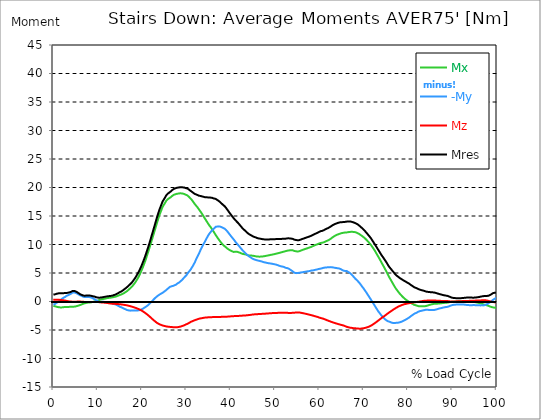
| Category |  Mx |  -My |  Mz |  Mres |
|---|---|---|---|---|
| 0.0 | -0.78 | -0.549 | 0.324 | 1.223 |
| 0.167348456675344 | -0.805 | -0.505 | 0.324 | 1.229 |
| 0.334696913350688 | -0.83 | -0.449 | 0.324 | 1.248 |
| 0.5020453700260321 | -0.867 | -0.356 | 0.306 | 1.304 |
| 0.669393826701376 | -0.905 | -0.262 | 0.306 | 1.341 |
| 0.83674228337672 | -0.936 | -0.168 | 0.306 | 1.385 |
| 1.0040907400520642 | -0.967 | -0.081 | 0.306 | 1.404 |
| 1.1621420602454444 | -0.998 | 0.006 | 0.312 | 1.435 |
| 1.3294905169207885 | -1.023 | 0.106 | 0.299 | 1.46 |
| 1.4968389735961325 | -1.036 | 0.206 | 0.274 | 1.447 |
| 1.6641874302714765 | -1.042 | 0.306 | 0.256 | 1.441 |
| 1.8315358869468206 | -1.036 | 0.405 | 0.243 | 1.441 |
| 1.9988843436221646 | -1.029 | 0.505 | 0.231 | 1.46 |
| 2.1662328002975086 | -1.017 | 0.599 | 0.218 | 1.466 |
| 2.333581256972853 | -0.992 | 0.674 | 0.206 | 1.466 |
| 2.5009297136481967 | -0.973 | 0.736 | 0.181 | 1.478 |
| 2.6682781703235405 | -0.961 | 0.805 | 0.162 | 1.485 |
| 2.8356266269988843 | -0.948 | 0.873 | 0.137 | 1.485 |
| 3.002975083674229 | -0.961 | 1.004 | 0.094 | 1.491 |
| 3.1703235403495724 | -0.954 | 1.048 | 0.075 | 1.522 |
| 3.337671997024917 | -0.948 | 1.098 | 0.05 | 1.547 |
| 3.4957233172182973 | -0.942 | 1.16 | 0.031 | 1.572 |
| 3.663071773893641 | -0.942 | 1.235 | 0.012 | 1.616 |
| 3.8304202305689854 | -0.936 | 1.304 | 0.006 | 1.653 |
| 3.997768687244329 | -0.929 | 1.372 | -0.012 | 1.697 |
| 4.165117143919673 | -0.929 | 1.472 | -0.025 | 1.778 |
| 4.332465600595017 | -0.929 | 1.572 | -0.037 | 1.859 |
| 4.499814057270361 | -0.917 | 1.603 | -0.044 | 1.878 |
| 4.667162513945706 | -0.905 | 1.591 | -0.056 | 1.859 |
| 4.834510970621049 | -0.892 | 1.566 | -0.062 | 1.834 |
| 5.001859427296393 | -0.867 | 1.528 | -0.037 | 1.784 |
| 5.169207883971737 | -0.83 | 1.478 | -0.025 | 1.722 |
| 5.336556340647081 | -0.798 | 1.41 | -0.019 | 1.647 |
| 5.503904797322425 | -0.761 | 1.329 | -0.019 | 1.553 |
| 5.671253253997769 | -0.724 | 1.248 | -0.012 | 1.466 |
| 5.82930457419115 | -0.68 | 1.185 | -0.019 | 1.391 |
| 5.996653030866494 | -0.63 | 1.104 | -0.019 | 1.298 |
| 6.164001487541838 | -0.58 | 1.048 | -0.025 | 1.229 |
| 6.331349944217181 | -0.524 | 0.998 | -0.025 | 1.173 |
| 6.498698400892526 | -0.468 | 0.929 | -0.037 | 1.117 |
| 6.66604685756787 | -0.418 | 0.867 | -0.05 | 1.067 |
| 6.833395314243213 | -0.368 | 0.817 | -0.062 | 1.036 |
| 7.000743770918558 | -0.324 | 0.786 | -0.075 | 1.017 |
| 7.168092227593902 | -0.293 | 0.774 | -0.087 | 1.023 |
| 7.335440684269246 | -0.262 | 0.78 | -0.094 | 1.036 |
| 7.50278914094459 | -0.237 | 0.774 | -0.1 | 1.036 |
| 7.6701375976199335 | -0.206 | 0.767 | -0.106 | 1.036 |
| 7.837486054295278 | -0.187 | 0.78 | -0.106 | 1.048 |
| 7.995537374488658 | -0.175 | 0.786 | -0.106 | 1.06 |
| 8.162885831164003 | -0.168 | 0.774 | -0.094 | 1.048 |
| 8.330234287839346 | -0.156 | 0.749 | -0.094 | 1.029 |
| 8.49758274451469 | -0.143 | 0.711 | -0.094 | 0.998 |
| 8.664931201190035 | -0.119 | 0.649 | -0.087 | 0.967 |
| 8.832279657865378 | -0.087 | 0.593 | -0.081 | 0.923 |
| 8.999628114540721 | -0.056 | 0.524 | -0.087 | 0.905 |
| 9.166976571216066 | -0.031 | 0.449 | -0.094 | 0.886 |
| 9.334325027891412 | 0.006 | 0.374 | -0.094 | 0.848 |
| 9.501673484566755 | 0.044 | 0.293 | -0.087 | 0.786 |
| 9.669021941242098 | 0.075 | 0.225 | -0.094 | 0.736 |
| 9.836370397917442 | 0.119 | 0.156 | -0.094 | 0.717 |
| 10.003718854592787 | 0.156 | 0.081 | -0.106 | 0.705 |
| 10.17106731126813 | 0.2 | 0 | -0.106 | 0.674 |
| 10.329118631461512 | 0.262 | -0.1 | -0.112 | 0.655 |
| 10.496467088136853 | 0.306 | -0.125 | -0.125 | 0.674 |
| 10.663815544812199 | 0.343 | -0.112 | -0.143 | 0.692 |
| 10.831164001487544 | 0.368 | -0.056 | -0.162 | 0.699 |
| 10.998512458162887 | 0.405 | -0.037 | -0.175 | 0.73 |
| 11.16586091483823 | 0.437 | -0.031 | -0.181 | 0.767 |
| 11.333209371513574 | 0.455 | -0.044 | -0.193 | 0.78 |
| 11.50055782818892 | 0.48 | -0.069 | -0.2 | 0.805 |
| 11.667906284864264 | 0.505 | -0.112 | -0.212 | 0.83 |
| 11.835254741539607 | 0.53 | -0.143 | -0.225 | 0.855 |
| 12.00260319821495 | 0.568 | -0.187 | -0.243 | 0.88 |
| 12.169951654890292 | 0.599 | -0.218 | -0.262 | 0.911 |
| 12.337300111565641 | 0.618 | -0.225 | -0.287 | 0.923 |
| 12.504648568240984 | 0.636 | -0.231 | -0.312 | 0.936 |
| 12.662699888434362 | 0.655 | -0.256 | -0.331 | 0.954 |
| 12.830048345109708 | 0.667 | -0.262 | -0.349 | 0.967 |
| 12.997396801785053 | 0.686 | -0.274 | -0.362 | 0.986 |
| 13.164745258460396 | 0.705 | -0.299 | -0.374 | 0.998 |
| 13.33209371513574 | 0.73 | -0.343 | -0.381 | 1.029 |
| 13.499442171811083 | 0.761 | -0.393 | -0.387 | 1.073 |
| 13.666790628486426 | 0.798 | -0.449 | -0.393 | 1.129 |
| 13.834139085161771 | 0.817 | -0.462 | -0.405 | 1.16 |
| 14.001487541837117 | 0.848 | -0.505 | -0.418 | 1.21 |
| 14.16883599851246 | 0.892 | -0.568 | -0.424 | 1.273 |
| 14.336184455187803 | 0.936 | -0.63 | -0.437 | 1.347 |
| 14.503532911863147 | 0.986 | -0.699 | -0.443 | 1.41 |
| 14.670881368538492 | 1.036 | -0.774 | -0.455 | 1.485 |
| 14.828932688731873 | 1.085 | -0.836 | -0.468 | 1.553 |
| 14.996281145407215 | 1.142 | -0.923 | -0.474 | 1.647 |
| 15.163629602082558 | 1.191 | -0.973 | -0.487 | 1.709 |
| 15.330978058757903 | 1.241 | -1.004 | -0.512 | 1.759 |
| 15.498326515433247 | 1.291 | -1.06 | -0.53 | 1.84 |
| 15.665674972108594 | 1.354 | -1.148 | -0.549 | 1.94 |
| 15.833023428783937 | 1.416 | -1.21 | -0.568 | 2.034 |
| 16.00037188545928 | 1.497 | -1.279 | -0.586 | 2.14 |
| 16.167720342134626 | 1.578 | -1.335 | -0.611 | 2.239 |
| 16.335068798809967 | 1.672 | -1.385 | -0.636 | 2.339 |
| 16.502417255485312 | 1.759 | -1.441 | -0.655 | 2.445 |
| 16.669765712160658 | 1.853 | -1.503 | -0.68 | 2.558 |
| 16.837114168836 | 1.959 | -1.528 | -0.711 | 2.664 |
| 17.004462625511344 | 2.084 | -1.56 | -0.749 | 2.795 |
| 17.16251394570472 | 2.208 | -1.584 | -0.78 | 2.919 |
| 17.32986240238007 | 2.321 | -1.603 | -0.817 | 3.038 |
| 17.497210859055414 | 2.433 | -1.609 | -0.855 | 3.163 |
| 17.664559315730756 | 2.564 | -1.591 | -0.892 | 3.294 |
| 17.8319077724061 | 2.707 | -1.547 | -0.936 | 3.45 |
| 17.999256229081443 | 2.863 | -1.566 | -0.979 | 3.624 |
| 18.166604685756788 | 3.032 | -1.597 | -1.017 | 3.811 |
| 18.333953142432133 | 3.194 | -1.572 | -1.054 | 3.986 |
| 18.501301599107478 | 3.369 | -1.566 | -1.104 | 4.18 |
| 18.668650055782823 | 3.574 | -1.578 | -1.154 | 4.398 |
| 18.835998512458165 | 3.793 | -1.578 | -1.204 | 4.622 |
| 19.00334696913351 | 4.005 | -1.578 | -1.254 | 4.853 |
| 19.170695425808855 | 4.236 | -1.566 | -1.31 | 5.084 |
| 19.338043882484197 | 4.491 | -1.522 | -1.366 | 5.34 |
| 19.496095202677576 | 4.766 | -1.51 | -1.429 | 5.602 |
| 19.66344365935292 | 5.047 | -1.472 | -1.491 | 5.882 |
| 19.830792116028263 | 5.346 | -1.41 | -1.56 | 6.169 |
| 19.998140572703612 | 5.645 | -1.335 | -1.634 | 6.481 |
| 20.165489029378953 | 5.957 | -1.254 | -1.722 | 6.806 |
| 20.3328374860543 | 6.294 | -1.198 | -1.803 | 7.136 |
| 20.500185942729644 | 6.644 | -1.11 | -1.89 | 7.486 |
| 20.667534399404985 | 6.993 | -1.023 | -1.977 | 7.841 |
| 20.83488285608033 | 7.367 | -0.936 | -2.071 | 8.209 |
| 21.002231312755672 | 7.76 | -0.855 | -2.171 | 8.596 |
| 21.16957976943102 | 8.172 | -0.767 | -2.277 | 9.002 |
| 21.336928226106362 | 8.571 | -0.655 | -2.383 | 9.401 |
| 21.504276682781704 | 8.97 | -0.543 | -2.495 | 9.8 |
| 21.67162513945705 | 9.376 | -0.424 | -2.601 | 10.212 |
| 21.82967645965043 | 9.806 | -0.306 | -2.714 | 10.642 |
| 21.997024916325774 | 10.237 | -0.162 | -2.838 | 11.085 |
| 22.16437337300112 | 10.667 | -0.019 | -2.957 | 11.534 |
| 22.33172182967646 | 11.085 | 0.112 | -3.082 | 11.965 |
| 22.499070286351806 | 11.515 | 0.256 | -3.194 | 12.408 |
| 22.666418743027148 | 11.946 | 0.387 | -3.3 | 12.85 |
| 22.833767199702496 | 12.376 | 0.518 | -3.406 | 13.293 |
| 23.00111565637784 | 12.813 | 0.643 | -3.518 | 13.742 |
| 23.168464113053183 | 13.25 | 0.767 | -3.631 | 14.204 |
| 23.335812569728528 | 13.693 | 0.867 | -3.724 | 14.647 |
| 23.50316102640387 | 14.11 | 0.967 | -3.799 | 15.065 |
| 23.670509483079215 | 14.522 | 1.067 | -3.88 | 15.483 |
| 23.83785793975456 | 14.94 | 1.167 | -3.955 | 15.895 |
| 23.995909259947936 | 15.321 | 1.241 | -4.011 | 16.275 |
| 24.163257716623285 | 15.633 | 1.316 | -4.067 | 16.587 |
| 24.330606173298627 | 15.976 | 1.391 | -4.117 | 16.924 |
| 24.49795462997397 | 16.325 | 1.466 | -4.167 | 17.267 |
| 24.665303086649313 | 16.643 | 1.541 | -4.217 | 17.585 |
| 24.83265154332466 | 16.855 | 1.641 | -4.248 | 17.791 |
| 25.0 | 17.055 | 1.74 | -4.279 | 17.991 |
| 25.167348456675345 | 17.267 | 1.822 | -4.311 | 18.209 |
| 25.334696913350694 | 17.492 | 1.928 | -4.348 | 18.44 |
| 25.502045370026035 | 17.704 | 2.027 | -4.379 | 18.658 |
| 25.669393826701377 | 17.841 | 2.152 | -4.398 | 18.802 |
| 25.836742283376722 | 17.959 | 2.277 | -4.417 | 18.926 |
| 26.004090740052067 | 18.072 | 2.377 | -4.429 | 19.051 |
| 26.17143919672741 | 18.128 | 2.483 | -4.448 | 19.12 |
| 26.329490516920792 | 18.196 | 2.576 | -4.46 | 19.201 |
| 26.49683897359613 | 18.309 | 2.632 | -4.466 | 19.326 |
| 26.66418743027148 | 18.427 | 2.676 | -4.479 | 19.444 |
| 26.831535886946828 | 18.54 | 2.707 | -4.498 | 19.563 |
| 26.998884343622166 | 18.627 | 2.739 | -4.504 | 19.656 |
| 27.166232800297514 | 18.708 | 2.782 | -4.504 | 19.743 |
| 27.333581256972852 | 18.758 | 2.845 | -4.504 | 19.8 |
| 27.5009297136482 | 18.814 | 2.907 | -4.516 | 19.856 |
| 27.668278170323543 | 18.87 | 2.963 | -4.523 | 19.918 |
| 27.835626626998888 | 18.883 | 3.063 | -4.516 | 19.943 |
| 28.002975083674233 | 18.901 | 3.163 | -4.504 | 19.962 |
| 28.170323540349575 | 18.933 | 3.244 | -4.485 | 19.993 |
| 28.33767199702492 | 18.951 | 3.312 | -4.46 | 20.012 |
| 28.50502045370026 | 18.97 | 3.406 | -4.429 | 20.03 |
| 28.663071773893645 | 18.976 | 3.531 | -4.404 | 20.043 |
| 28.830420230568986 | 18.97 | 3.649 | -4.367 | 20.037 |
| 28.99776868724433 | 18.951 | 3.762 | -4.323 | 20.03 |
| 29.165117143919673 | 18.933 | 3.893 | -4.273 | 20.024 |
| 29.33246560059502 | 18.914 | 4.049 | -4.229 | 20.018 |
| 29.499814057270367 | 18.876 | 4.198 | -4.18 | 19.999 |
| 29.66716251394571 | 18.814 | 4.342 | -4.123 | 19.956 |
| 29.834510970621054 | 18.745 | 4.46 | -4.055 | 19.899 |
| 30.00185942729639 | 18.708 | 4.591 | -3.992 | 19.874 |
| 30.169207883971744 | 18.639 | 4.785 | -3.936 | 19.837 |
| 30.33655634064708 | 18.54 | 5.003 | -3.886 | 19.781 |
| 30.50390479732243 | 18.427 | 5.171 | -3.811 | 19.694 |
| 30.671253253997772 | 18.302 | 5.315 | -3.73 | 19.588 |
| 30.829304574191156 | 18.165 | 5.446 | -3.649 | 19.475 |
| 30.996653030866494 | 18.028 | 5.62 | -3.574 | 19.382 |
| 31.164001487541842 | 17.885 | 5.864 | -3.525 | 19.301 |
| 31.331349944217187 | 17.716 | 6.057 | -3.462 | 19.195 |
| 31.498698400892525 | 17.541 | 6.275 | -3.406 | 19.101 |
| 31.666046857567874 | 17.354 | 6.525 | -3.356 | 19.007 |
| 31.833395314243212 | 17.173 | 6.756 | -3.3 | 18.908 |
| 32.00074377091856 | 17.005 | 7.024 | -3.25 | 18.826 |
| 32.1680922275939 | 16.849 | 7.336 | -3.213 | 18.795 |
| 32.33544068426925 | 16.693 | 7.617 | -3.169 | 18.745 |
| 32.50278914094459 | 16.531 | 7.879 | -3.119 | 18.683 |
| 32.670137597619934 | 16.362 | 8.128 | -3.075 | 18.627 |
| 32.83748605429528 | 16.175 | 8.371 | -3.038 | 18.558 |
| 33.004834510970625 | 15.988 | 8.677 | -2.994 | 18.54 |
| 33.162885831164004 | 15.801 | 8.97 | -2.969 | 18.521 |
| 33.33023428783935 | 15.608 | 9.264 | -2.944 | 18.483 |
| 33.497582744514695 | 15.42 | 9.507 | -2.926 | 18.44 |
| 33.664931201190036 | 15.221 | 9.756 | -2.901 | 18.396 |
| 33.83227965786538 | 15.015 | 10.018 | -2.882 | 18.377 |
| 33.99962811454073 | 14.79 | 10.249 | -2.845 | 18.346 |
| 34.16697657121607 | 14.578 | 10.467 | -2.826 | 18.302 |
| 34.33432502789141 | 14.379 | 10.729 | -2.813 | 18.29 |
| 34.50167348456676 | 14.173 | 10.979 | -2.801 | 18.284 |
| 34.6690219412421 | 13.967 | 11.216 | -2.795 | 18.271 |
| 34.83637039791744 | 13.761 | 11.447 | -2.782 | 18.265 |
| 35.00371885459279 | 13.555 | 11.678 | -2.77 | 18.259 |
| 35.17106731126814 | 13.362 | 11.884 | -2.757 | 18.259 |
| 35.338415767943474 | 13.194 | 12.052 | -2.751 | 18.246 |
| 35.49646708813686 | 13.031 | 12.195 | -2.745 | 18.221 |
| 35.6638155448122 | 12.838 | 12.376 | -2.745 | 18.215 |
| 35.831164001487544 | 12.638 | 12.514 | -2.745 | 18.184 |
| 35.998512458162885 | 12.445 | 12.62 | -2.739 | 18.128 |
| 36.165860914838234 | 12.252 | 12.726 | -2.739 | 18.078 |
| 36.333209371513576 | 12.033 | 12.869 | -2.732 | 18.047 |
| 36.50055782818892 | 11.821 | 13.019 | -2.732 | 18.034 |
| 36.667906284864266 | 11.615 | 13.119 | -2.726 | 17.991 |
| 36.83525474153961 | 11.422 | 13.131 | -2.726 | 17.891 |
| 37.002603198214956 | 11.235 | 13.15 | -2.72 | 17.797 |
| 37.1699516548903 | 11.041 | 13.175 | -2.72 | 17.716 |
| 37.337300111565646 | 10.86 | 13.181 | -2.714 | 17.623 |
| 37.50464856824098 | 10.686 | 13.162 | -2.707 | 17.516 |
| 37.66269988843437 | 10.511 | 13.125 | -2.701 | 17.398 |
| 37.83004834510971 | 10.343 | 13.081 | -2.701 | 17.279 |
| 37.99739680178505 | 10.174 | 13.031 | -2.695 | 17.155 |
| 38.16474525846039 | 10.037 | 12.956 | -2.689 | 17.03 |
| 38.33209371513574 | 9.9 | 12.894 | -2.689 | 16.905 |
| 38.49944217181109 | 9.781 | 12.838 | -2.689 | 16.812 |
| 38.666790628486424 | 9.681 | 12.763 | -2.682 | 16.693 |
| 38.83413908516178 | 9.582 | 12.645 | -2.676 | 16.55 |
| 39.001487541837115 | 9.463 | 12.52 | -2.67 | 16.387 |
| 39.16883599851246 | 9.357 | 12.358 | -2.664 | 16.194 |
| 39.336184455187805 | 9.245 | 12.214 | -2.651 | 16.013 |
| 39.503532911863154 | 9.145 | 12.052 | -2.645 | 15.832 |
| 39.670881368538495 | 9.07 | 11.871 | -2.632 | 15.639 |
| 39.83822982521384 | 9.002 | 11.709 | -2.62 | 15.47 |
| 39.996281145407224 | 8.933 | 11.54 | -2.608 | 15.296 |
| 40.163629602082565 | 8.871 | 11.378 | -2.601 | 15.121 |
| 40.33097805875791 | 8.808 | 11.216 | -2.589 | 14.953 |
| 40.498326515433256 | 8.746 | 11.066 | -2.576 | 14.79 |
| 40.6656749721086 | 8.696 | 10.904 | -2.57 | 14.622 |
| 40.83302342878393 | 8.677 | 10.754 | -2.558 | 14.479 |
| 41.00037188545929 | 8.721 | 10.555 | -2.551 | 14.323 |
| 41.16772034213463 | 8.74 | 10.374 | -2.545 | 14.179 |
| 41.33506879880997 | 8.746 | 10.205 | -2.539 | 14.048 |
| 41.50241725548531 | 8.69 | 10.074 | -2.533 | 13.905 |
| 41.66976571216066 | 8.665 | 9.937 | -2.526 | 13.786 |
| 41.837114168836 | 8.621 | 9.781 | -2.526 | 13.63 |
| 42.004462625511344 | 8.577 | 9.625 | -2.52 | 13.48 |
| 42.17181108218669 | 8.527 | 9.463 | -2.514 | 13.325 |
| 42.32986240238007 | 8.471 | 9.301 | -2.501 | 13.162 |
| 42.497210859055414 | 8.415 | 9.145 | -2.495 | 13 |
| 42.66455931573076 | 8.359 | 9.008 | -2.477 | 12.857 |
| 42.831907772406105 | 8.328 | 8.864 | -2.47 | 12.719 |
| 42.999256229081446 | 8.309 | 8.733 | -2.464 | 12.607 |
| 43.16660468575679 | 8.297 | 8.596 | -2.452 | 12.489 |
| 43.33395314243214 | 8.265 | 8.471 | -2.445 | 12.37 |
| 43.50130159910748 | 8.216 | 8.347 | -2.433 | 12.239 |
| 43.66865005578282 | 8.172 | 8.234 | -2.42 | 12.121 |
| 43.83599851245817 | 8.122 | 8.122 | -2.408 | 12.002 |
| 44.00334696913351 | 8.091 | 8.01 | -2.389 | 11.896 |
| 44.17069542580886 | 8.066 | 7.91 | -2.383 | 11.796 |
| 44.3380438824842 | 8.066 | 7.823 | -2.364 | 11.728 |
| 44.49609520267758 | 8.066 | 7.735 | -2.339 | 11.665 |
| 44.66344365935292 | 8.06 | 7.648 | -2.321 | 11.59 |
| 44.83079211602827 | 8.041 | 7.561 | -2.302 | 11.515 |
| 44.99814057270361 | 8.028 | 7.486 | -2.283 | 11.441 |
| 45.16548902937895 | 8.003 | 7.423 | -2.271 | 11.384 |
| 45.332837486054295 | 7.978 | 7.367 | -2.258 | 11.322 |
| 45.500185942729644 | 7.954 | 7.336 | -2.246 | 11.278 |
| 45.66753439940499 | 7.929 | 7.305 | -2.239 | 11.235 |
| 45.83488285608033 | 7.904 | 7.249 | -2.233 | 11.172 |
| 46.00223131275568 | 7.879 | 7.217 | -2.221 | 11.129 |
| 46.16957976943102 | 7.866 | 7.18 | -2.215 | 11.091 |
| 46.336928226106366 | 7.872 | 7.149 | -2.208 | 11.06 |
| 46.50427668278171 | 7.872 | 7.124 | -2.196 | 11.035 |
| 46.671625139457056 | 7.872 | 7.093 | -2.19 | 11.016 |
| 46.829676459650436 | 7.879 | 7.061 | -2.177 | 10.991 |
| 46.99702491632577 | 7.891 | 7.018 | -2.171 | 10.967 |
| 47.16437337300112 | 7.904 | 6.974 | -2.165 | 10.942 |
| 47.33172182967646 | 7.916 | 6.93 | -2.152 | 10.917 |
| 47.49907028635181 | 7.929 | 6.893 | -2.146 | 10.892 |
| 47.66641874302716 | 7.96 | 6.868 | -2.14 | 10.892 |
| 47.83376719970249 | 7.985 | 6.837 | -2.133 | 10.892 |
| 48.001115656377834 | 8.01 | 6.806 | -2.121 | 10.885 |
| 48.16846411305319 | 8.028 | 6.775 | -2.115 | 10.879 |
| 48.33581256972853 | 8.06 | 6.743 | -2.102 | 10.879 |
| 48.50316102640387 | 8.091 | 6.725 | -2.09 | 10.885 |
| 48.67050948307921 | 8.116 | 6.712 | -2.077 | 10.892 |
| 48.837857939754564 | 8.147 | 6.687 | -2.071 | 10.904 |
| 49.005206396429905 | 8.178 | 6.675 | -2.059 | 10.91 |
| 49.163257716623285 | 8.197 | 6.65 | -2.046 | 10.91 |
| 49.33060617329863 | 8.222 | 6.625 | -2.04 | 10.91 |
| 49.49795462997397 | 8.247 | 6.594 | -2.027 | 10.91 |
| 49.66530308664932 | 8.278 | 6.569 | -2.021 | 10.917 |
| 49.832651543324666 | 8.303 | 6.537 | -2.021 | 10.923 |
| 50.0 | 8.334 | 6.506 | -2.015 | 10.929 |
| 50.16734845667534 | 8.371 | 6.488 | -2.015 | 10.948 |
| 50.33469691335069 | 8.409 | 6.469 | -2.015 | 10.967 |
| 50.50204537002604 | 8.44 | 6.413 | -1.996 | 10.954 |
| 50.66939382670139 | 8.471 | 6.363 | -1.99 | 10.948 |
| 50.836742283376715 | 8.496 | 6.3 | -1.971 | 10.935 |
| 51.00409074005207 | 8.534 | 6.263 | -1.971 | 10.954 |
| 51.17143919672741 | 8.571 | 6.213 | -1.971 | 10.948 |
| 51.32949051692079 | 8.609 | 6.176 | -1.971 | 10.96 |
| 51.496838973596134 | 8.646 | 6.144 | -1.977 | 10.979 |
| 51.66418743027148 | 8.677 | 6.132 | -1.984 | 11.004 |
| 51.831535886946824 | 8.715 | 6.107 | -1.984 | 11.016 |
| 51.99888434362217 | 8.752 | 6.07 | -1.984 | 11.029 |
| 52.16623280029752 | 8.783 | 6.007 | -1.984 | 11.029 |
| 52.33358125697285 | 8.821 | 5.939 | -1.971 | 11.016 |
| 52.5009297136482 | 8.858 | 5.882 | -1.971 | 11.023 |
| 52.668278170323546 | 8.895 | 5.87 | -1.977 | 11.06 |
| 52.835626626998895 | 8.927 | 5.851 | -1.99 | 11.085 |
| 53.00297508367424 | 8.952 | 5.808 | -2.002 | 11.091 |
| 53.17032354034958 | 8.964 | 5.733 | -2.009 | 11.079 |
| 53.33767199702492 | 8.977 | 5.652 | -2.009 | 11.066 |
| 53.50502045370027 | 8.989 | 5.546 | -2.002 | 11.048 |
| 53.663071773893655 | 8.995 | 5.465 | -2.002 | 11.035 |
| 53.83042023056899 | 8.995 | 5.377 | -1.996 | 11.016 |
| 53.99776868724433 | 8.983 | 5.277 | -1.984 | 10.985 |
| 54.16511714391967 | 8.933 | 5.171 | -1.971 | 10.923 |
| 54.33246560059503 | 8.877 | 5.078 | -1.959 | 10.867 |
| 54.49981405727037 | 8.846 | 5.015 | -1.959 | 10.823 |
| 54.667162513945705 | 8.821 | 4.984 | -1.946 | 10.798 |
| 54.834510970621054 | 8.802 | 4.978 | -1.928 | 10.779 |
| 55.0018594272964 | 8.777 | 4.99 | -1.915 | 10.754 |
| 55.169207883971744 | 8.777 | 4.997 | -1.915 | 10.742 |
| 55.336556340647086 | 8.796 | 5.028 | -1.921 | 10.748 |
| 55.50390479732243 | 8.833 | 5.047 | -1.94 | 10.779 |
| 55.671253253997776 | 8.877 | 5.078 | -1.953 | 10.817 |
| 55.83860171067312 | 8.927 | 5.084 | -1.977 | 10.867 |
| 55.9966530308665 | 8.989 | 5.109 | -2.002 | 10.929 |
| 56.16400148754184 | 9.039 | 5.134 | -2.027 | 10.979 |
| 56.33134994421718 | 9.083 | 5.159 | -2.052 | 11.01 |
| 56.498698400892536 | 9.126 | 5.178 | -2.084 | 11.054 |
| 56.66604685756788 | 9.176 | 5.203 | -2.108 | 11.104 |
| 56.83339531424321 | 9.22 | 5.221 | -2.14 | 11.147 |
| 57.00074377091856 | 9.264 | 5.246 | -2.171 | 11.197 |
| 57.16809222759391 | 9.307 | 5.271 | -2.202 | 11.241 |
| 57.33544068426925 | 9.351 | 5.277 | -2.233 | 11.285 |
| 57.5027891409446 | 9.401 | 5.302 | -2.271 | 11.335 |
| 57.670137597619934 | 9.444 | 5.321 | -2.302 | 11.378 |
| 57.83748605429528 | 9.488 | 5.352 | -2.327 | 11.422 |
| 58.004834510970625 | 9.526 | 5.396 | -2.358 | 11.472 |
| 58.16288583116401 | 9.582 | 5.421 | -2.389 | 11.534 |
| 58.330234287839346 | 9.638 | 5.44 | -2.42 | 11.59 |
| 58.497582744514695 | 9.694 | 5.458 | -2.458 | 11.646 |
| 58.66493120119004 | 9.756 | 5.477 | -2.501 | 11.715 |
| 58.832279657865385 | 9.819 | 5.508 | -2.539 | 11.777 |
| 58.999628114540734 | 9.875 | 5.533 | -2.576 | 11.846 |
| 59.16697657121607 | 9.931 | 5.564 | -2.62 | 11.915 |
| 59.33432502789142 | 9.975 | 5.596 | -2.651 | 11.971 |
| 59.50167348456676 | 10.025 | 5.627 | -2.682 | 12.027 |
| 59.66902194124211 | 10.074 | 5.658 | -2.726 | 12.089 |
| 59.83637039791745 | 10.131 | 5.695 | -2.776 | 12.164 |
| 60.00371885459278 | 10.187 | 5.727 | -2.826 | 12.233 |
| 60.17106731126813 | 10.249 | 5.745 | -2.87 | 12.301 |
| 60.33841576794349 | 10.274 | 5.77 | -2.901 | 12.339 |
| 60.49646708813685 | 10.293 | 5.801 | -2.932 | 12.37 |
| 60.6638155448122 | 10.312 | 5.845 | -2.963 | 12.401 |
| 60.831164001487544 | 10.336 | 5.882 | -3.007 | 12.451 |
| 60.99851245816289 | 10.386 | 5.907 | -3.05 | 12.507 |
| 61.16586091483824 | 10.443 | 5.939 | -3.107 | 12.582 |
| 61.333209371513576 | 10.505 | 5.957 | -3.156 | 12.651 |
| 61.50055782818892 | 10.567 | 5.97 | -3.206 | 12.713 |
| 61.667906284864266 | 10.623 | 5.982 | -3.263 | 12.776 |
| 61.835254741539615 | 10.68 | 5.995 | -3.312 | 12.832 |
| 62.002603198214956 | 10.736 | 6.007 | -3.362 | 12.894 |
| 62.16995165489029 | 10.804 | 6.02 | -3.412 | 12.963 |
| 62.33730011156564 | 10.879 | 6.026 | -3.462 | 13.044 |
| 62.504648568240995 | 10.96 | 6.032 | -3.512 | 13.125 |
| 62.67199702491633 | 11.06 | 6.026 | -3.556 | 13.212 |
| 62.83004834510971 | 11.166 | 6.007 | -3.606 | 13.3 |
| 62.99739680178505 | 11.266 | 5.995 | -3.649 | 13.381 |
| 63.1647452584604 | 11.353 | 5.964 | -3.693 | 13.449 |
| 63.33209371513575 | 11.441 | 5.939 | -3.737 | 13.518 |
| 63.4994421718111 | 11.515 | 5.914 | -3.774 | 13.58 |
| 63.666790628486424 | 11.584 | 5.895 | -3.818 | 13.636 |
| 63.83413908516177 | 11.653 | 5.87 | -3.855 | 13.686 |
| 64.00148754183712 | 11.709 | 5.858 | -3.893 | 13.736 |
| 64.16883599851248 | 11.765 | 5.833 | -3.936 | 13.78 |
| 64.3361844551878 | 11.809 | 5.82 | -3.974 | 13.824 |
| 64.50353291186315 | 11.859 | 5.789 | -4.011 | 13.855 |
| 64.6708813685385 | 11.902 | 5.739 | -4.049 | 13.886 |
| 64.83822982521384 | 11.946 | 5.677 | -4.08 | 13.905 |
| 65.00557828188919 | 11.99 | 5.608 | -4.117 | 13.917 |
| 65.16362960208257 | 12.027 | 5.533 | -4.148 | 13.923 |
| 65.3309780587579 | 12.046 | 5.471 | -4.186 | 13.93 |
| 65.49832651543326 | 12.071 | 5.402 | -4.223 | 13.936 |
| 65.6656749721086 | 12.083 | 5.371 | -4.267 | 13.948 |
| 65.83302342878395 | 12.083 | 5.358 | -4.323 | 13.961 |
| 66.00037188545929 | 12.089 | 5.358 | -4.385 | 13.992 |
| 66.16772034213463 | 12.108 | 5.352 | -4.448 | 14.023 |
| 66.33506879880998 | 12.139 | 5.277 | -4.479 | 14.036 |
| 66.50241725548531 | 12.17 | 5.19 | -4.516 | 14.042 |
| 66.66976571216065 | 12.189 | 5.096 | -4.535 | 14.036 |
| 66.83711416883601 | 12.202 | 5.034 | -4.572 | 14.036 |
| 67.00446262551135 | 12.214 | 4.972 | -4.61 | 14.042 |
| 67.1718110821867 | 12.227 | 4.822 | -4.622 | 14.004 |
| 67.32986240238007 | 12.233 | 4.672 | -4.629 | 13.973 |
| 67.49721085905541 | 12.22 | 4.56 | -4.654 | 13.936 |
| 67.66455931573076 | 12.202 | 4.423 | -4.679 | 13.892 |
| 67.83190777240611 | 12.189 | 4.248 | -4.679 | 13.836 |
| 67.99925622908145 | 12.17 | 4.092 | -4.691 | 13.786 |
| 68.16660468575678 | 12.146 | 3.961 | -4.703 | 13.73 |
| 68.33395314243214 | 12.108 | 3.836 | -4.722 | 13.674 |
| 68.50130159910749 | 12.046 | 3.724 | -4.735 | 13.599 |
| 68.66865005578282 | 11.983 | 3.599 | -4.747 | 13.518 |
| 68.83599851245816 | 11.915 | 3.45 | -4.76 | 13.424 |
| 69.00334696913352 | 11.84 | 3.294 | -4.766 | 13.318 |
| 69.17069542580886 | 11.753 | 3.138 | -4.766 | 13.206 |
| 69.3380438824842 | 11.659 | 2.982 | -4.76 | 13.087 |
| 69.50539233915956 | 11.578 | 2.788 | -4.741 | 12.981 |
| 69.66344365935292 | 11.484 | 2.608 | -4.722 | 12.857 |
| 69.83079211602826 | 11.384 | 2.439 | -4.71 | 12.732 |
| 69.99814057270362 | 11.272 | 2.271 | -4.691 | 12.607 |
| 70.16548902937896 | 11.166 | 2.084 | -4.66 | 12.47 |
| 70.33283748605429 | 11.054 | 1.89 | -4.629 | 12.333 |
| 70.50018594272964 | 10.935 | 1.703 | -4.604 | 12.189 |
| 70.667534399405 | 10.792 | 1.516 | -4.56 | 12.027 |
| 70.83488285608033 | 10.648 | 1.31 | -4.523 | 11.871 |
| 71.00223131275568 | 10.511 | 1.11 | -4.473 | 11.715 |
| 71.16957976943102 | 10.361 | 0.911 | -4.423 | 11.559 |
| 71.33692822610637 | 10.218 | 0.699 | -4.36 | 11.403 |
| 71.50427668278171 | 10.074 | 0.505 | -4.304 | 11.253 |
| 71.67162513945706 | 9.9 | 0.299 | -4.236 | 11.073 |
| 71.8389735961324 | 9.713 | 0.094 | -4.155 | 10.867 |
| 71.99702491632577 | 9.526 | -0.112 | -4.073 | 10.655 |
| 72.16437337300113 | 9.345 | -0.324 | -3.992 | 10.467 |
| 72.33172182967647 | 9.139 | -0.53 | -3.899 | 10.255 |
| 72.49907028635181 | 8.933 | -0.736 | -3.811 | 10.056 |
| 72.66641874302715 | 8.715 | -0.948 | -3.712 | 9.85 |
| 72.8337671997025 | 8.49 | -1.16 | -3.618 | 9.65 |
| 73.00111565637783 | 8.265 | -1.36 | -3.525 | 9.438 |
| 73.16846411305319 | 8.041 | -1.566 | -3.418 | 9.22 |
| 73.33581256972853 | 7.823 | -1.759 | -3.319 | 9.014 |
| 73.50316102640387 | 7.592 | -1.934 | -3.219 | 8.814 |
| 73.67050948307921 | 7.355 | -2.102 | -3.119 | 8.596 |
| 73.83785793975457 | 7.124 | -2.277 | -3.019 | 8.384 |
| 74.00520639642991 | 6.874 | -2.439 | -2.926 | 8.184 |
| 74.16325771662328 | 6.637 | -2.608 | -2.826 | 7.985 |
| 74.33060617329863 | 6.406 | -2.745 | -2.726 | 7.804 |
| 74.49795462997398 | 6.176 | -2.888 | -2.632 | 7.61 |
| 74.66530308664932 | 5.926 | -2.994 | -2.551 | 7.43 |
| 74.83265154332466 | 5.689 | -3.1 | -2.458 | 7.23 |
| 75.00000000000001 | 5.446 | -3.225 | -2.358 | 7.037 |
| 75.16734845667534 | 5.196 | -3.319 | -2.258 | 6.831 |
| 75.3346969133507 | 4.934 | -3.406 | -2.158 | 6.625 |
| 75.50204537002605 | 4.666 | -3.462 | -2.065 | 6.394 |
| 75.66939382670138 | 4.417 | -3.512 | -1.971 | 6.194 |
| 75.83674228337672 | 4.18 | -3.549 | -1.878 | 6.007 |
| 76.00409074005208 | 3.955 | -3.599 | -1.79 | 5.851 |
| 76.17143919672742 | 3.737 | -3.656 | -1.703 | 5.695 |
| 76.33878765340276 | 3.506 | -3.712 | -1.616 | 5.539 |
| 76.49683897359614 | 3.275 | -3.749 | -1.522 | 5.377 |
| 76.66418743027148 | 3.05 | -3.78 | -1.435 | 5.215 |
| 76.83153588694682 | 2.82 | -3.793 | -1.354 | 5.065 |
| 76.99888434362218 | 2.601 | -3.774 | -1.273 | 4.903 |
| 77.16623280029752 | 2.389 | -3.762 | -1.191 | 4.747 |
| 77.33358125697285 | 2.196 | -3.743 | -1.11 | 4.61 |
| 77.5009297136482 | 2.021 | -3.737 | -1.036 | 4.504 |
| 77.66827817032356 | 1.853 | -3.743 | -0.961 | 4.417 |
| 77.83562662699889 | 1.684 | -3.724 | -0.892 | 4.323 |
| 78.00297508367423 | 1.516 | -3.68 | -0.83 | 4.211 |
| 78.17032354034959 | 1.354 | -3.643 | -0.774 | 4.105 |
| 78.33767199702493 | 1.21 | -3.599 | -0.717 | 4.024 |
| 78.50502045370027 | 1.073 | -3.562 | -0.661 | 3.949 |
| 78.67236891037561 | 0.936 | -3.512 | -0.611 | 3.874 |
| 78.83042023056899 | 0.798 | -3.45 | -0.568 | 3.78 |
| 78.99776868724433 | 0.674 | -3.381 | -0.524 | 3.693 |
| 79.16511714391969 | 0.555 | -3.312 | -0.48 | 3.612 |
| 79.33246560059503 | 0.449 | -3.244 | -0.443 | 3.543 |
| 79.49981405727036 | 0.343 | -3.175 | -0.418 | 3.487 |
| 79.66716251394571 | 0.243 | -3.1 | -0.393 | 3.412 |
| 79.83451097062107 | 0.143 | -3.013 | -0.362 | 3.319 |
| 80.00185942729641 | 0.062 | -2.938 | -0.331 | 3.244 |
| 80.16920788397174 | -0.012 | -2.863 | -0.306 | 3.181 |
| 80.33655634064709 | -0.094 | -2.776 | -0.281 | 3.094 |
| 80.50390479732243 | -0.181 | -2.664 | -0.256 | 2.988 |
| 80.67125325399778 | -0.262 | -2.564 | -0.237 | 2.888 |
| 80.83860171067312 | -0.331 | -2.477 | -0.212 | 2.807 |
| 80.99665303086651 | -0.412 | -2.389 | -0.193 | 2.72 |
| 81.16400148754184 | -0.487 | -2.296 | -0.175 | 2.639 |
| 81.3313499442172 | -0.555 | -2.196 | -0.156 | 2.545 |
| 81.49869840089255 | -0.605 | -2.115 | -0.137 | 2.464 |
| 81.66604685756786 | -0.643 | -2.059 | -0.119 | 2.414 |
| 81.83339531424322 | -0.667 | -2.021 | -0.094 | 2.383 |
| 82.00074377091858 | -0.717 | -1.946 | -0.075 | 2.321 |
| 82.16809222759392 | -0.767 | -1.859 | -0.056 | 2.246 |
| 82.33544068426926 | -0.811 | -1.79 | -0.044 | 2.183 |
| 82.50278914094459 | -0.842 | -1.734 | -0.025 | 2.127 |
| 82.67013759761994 | -0.842 | -1.697 | 0 | 2.084 |
| 82.83748605429528 | -0.836 | -1.666 | 0.019 | 2.04 |
| 83.00483451097062 | -0.842 | -1.634 | 0.044 | 2.002 |
| 83.17218296764597 | -0.848 | -1.597 | 0.062 | 1.965 |
| 83.33023428783935 | -0.855 | -1.572 | 0.087 | 1.934 |
| 83.4975827445147 | -0.848 | -1.553 | 0.106 | 1.903 |
| 83.66493120119004 | -0.836 | -1.522 | 0.125 | 1.859 |
| 83.83227965786537 | -0.823 | -1.478 | 0.131 | 1.809 |
| 83.99962811454073 | -0.805 | -1.447 | 0.143 | 1.759 |
| 84.16697657121607 | -0.774 | -1.429 | 0.15 | 1.728 |
| 84.33432502789142 | -0.736 | -1.435 | 0.156 | 1.709 |
| 84.50167348456677 | -0.692 | -1.46 | 0.162 | 1.691 |
| 84.6690219412421 | -0.649 | -1.478 | 0.168 | 1.678 |
| 84.83637039791745 | -0.618 | -1.478 | 0.168 | 1.659 |
| 85.0037188545928 | -0.568 | -1.478 | 0.168 | 1.634 |
| 85.17106731126813 | -0.536 | -1.485 | 0.175 | 1.628 |
| 85.33841576794349 | -0.499 | -1.497 | 0.181 | 1.622 |
| 85.50576422461883 | -0.468 | -1.497 | 0.175 | 1.616 |
| 85.66381554481221 | -0.437 | -1.497 | 0.175 | 1.603 |
| 85.83116400148755 | -0.405 | -1.491 | 0.175 | 1.584 |
| 85.99851245816289 | -0.393 | -1.472 | 0.168 | 1.56 |
| 86.16586091483823 | -0.381 | -1.447 | 0.156 | 1.528 |
| 86.33320937151358 | -0.381 | -1.41 | 0.156 | 1.491 |
| 86.50055782818893 | -0.381 | -1.366 | 0.143 | 1.447 |
| 86.66790628486427 | -0.374 | -1.329 | 0.137 | 1.404 |
| 86.83525474153961 | -0.368 | -1.285 | 0.131 | 1.366 |
| 87.00260319821496 | -0.356 | -1.248 | 0.119 | 1.322 |
| 87.16995165489031 | -0.343 | -1.21 | 0.112 | 1.285 |
| 87.33730011156564 | -0.324 | -1.185 | 0.112 | 1.254 |
| 87.504648568241 | -0.306 | -1.154 | 0.106 | 1.223 |
| 87.67199702491634 | -0.293 | -1.123 | 0.1 | 1.185 |
| 87.83004834510972 | -0.274 | -1.085 | 0.094 | 1.148 |
| 87.99739680178506 | -0.262 | -1.054 | 0.087 | 1.117 |
| 88.1647452584604 | -0.25 | -1.023 | 0.081 | 1.085 |
| 88.33209371513574 | -0.231 | -0.998 | 0.081 | 1.06 |
| 88.49944217181108 | -0.225 | -0.986 | 0.081 | 1.042 |
| 88.66679062848644 | -0.212 | -0.967 | 0.081 | 1.023 |
| 88.83413908516178 | -0.2 | -0.948 | 0.075 | 0.998 |
| 89.00148754183712 | -0.187 | -0.917 | 0.075 | 0.967 |
| 89.16883599851246 | -0.156 | -0.873 | 0.056 | 0.917 |
| 89.33618445518782 | -0.119 | -0.823 | 0.037 | 0.861 |
| 89.50353291186315 | -0.094 | -0.767 | 0.012 | 0.798 |
| 89.6708813685385 | -0.075 | -0.711 | 0 | 0.742 |
| 89.83822982521386 | -0.056 | -0.661 | -0.006 | 0.692 |
| 90.00557828188919 | -0.044 | -0.624 | -0.006 | 0.661 |
| 90.16362960208257 | -0.037 | -0.599 | 0 | 0.636 |
| 90.3309780587579 | -0.037 | -0.58 | 0.006 | 0.624 |
| 90.49832651543326 | -0.025 | -0.568 | 0.012 | 0.611 |
| 90.66567497210859 | -0.012 | -0.555 | 0.012 | 0.593 |
| 90.83302342878395 | -0.006 | -0.543 | 0.019 | 0.58 |
| 91.00037188545929 | 0 | -0.536 | 0.025 | 0.574 |
| 91.16772034213463 | 0.012 | -0.53 | 0.031 | 0.568 |
| 91.33506879880998 | 0.025 | -0.53 | 0.037 | 0.568 |
| 91.50241725548533 | 0.031 | -0.536 | 0.044 | 0.568 |
| 91.66976571216065 | 0.044 | -0.53 | 0.05 | 0.568 |
| 91.83711416883601 | 0.05 | -0.536 | 0.056 | 0.574 |
| 92.00446262551137 | 0.056 | -0.536 | 0.062 | 0.586 |
| 92.1718110821867 | 0.069 | -0.53 | 0.069 | 0.599 |
| 92.33915953886203 | 0.081 | -0.53 | 0.069 | 0.611 |
| 92.49721085905541 | 0.087 | -0.53 | 0.075 | 0.624 |
| 92.66455931573077 | 0.087 | -0.543 | 0.081 | 0.643 |
| 92.83190777240611 | 0.081 | -0.561 | 0.081 | 0.655 |
| 92.99925622908145 | 0.075 | -0.58 | 0.087 | 0.667 |
| 93.1666046857568 | 0.056 | -0.599 | 0.1 | 0.68 |
| 93.33395314243214 | 0.056 | -0.611 | 0.1 | 0.686 |
| 93.50130159910749 | 0.056 | -0.618 | 0.1 | 0.686 |
| 93.66865005578283 | 0.044 | -0.63 | 0.106 | 0.692 |
| 93.83599851245818 | 0.044 | -0.63 | 0.112 | 0.686 |
| 94.00334696913353 | 0.025 | -0.649 | 0.119 | 0.686 |
| 94.17069542580886 | 0.006 | -0.655 | 0.125 | 0.686 |
| 94.3380438824842 | -0.012 | -0.655 | 0.131 | 0.686 |
| 94.50539233915954 | -0.025 | -0.643 | 0.131 | 0.68 |
| 94.66344365935292 | -0.044 | -0.63 | 0.131 | 0.667 |
| 94.83079211602828 | -0.069 | -0.63 | 0.137 | 0.667 |
| 94.99814057270362 | -0.094 | -0.63 | 0.143 | 0.68 |
| 95.16548902937897 | -0.119 | -0.649 | 0.156 | 0.705 |
| 95.33283748605432 | -0.143 | -0.661 | 0.162 | 0.724 |
| 95.50018594272963 | -0.168 | -0.655 | 0.162 | 0.724 |
| 95.66753439940499 | -0.193 | -0.643 | 0.162 | 0.73 |
| 95.83488285608034 | -0.225 | -0.661 | 0.175 | 0.761 |
| 96.00223131275567 | -0.256 | -0.655 | 0.181 | 0.774 |
| 96.16957976943102 | -0.293 | -0.661 | 0.187 | 0.805 |
| 96.33692822610638 | -0.324 | -0.686 | 0.193 | 0.848 |
| 96.50427668278171 | -0.362 | -0.692 | 0.2 | 0.88 |
| 96.67162513945706 | -0.393 | -0.667 | 0.2 | 0.886 |
| 96.8389735961324 | -0.437 | -0.674 | 0.206 | 0.911 |
| 96.99702491632577 | -0.487 | -0.686 | 0.218 | 0.942 |
| 97.16437337300111 | -0.524 | -0.661 | 0.218 | 0.961 |
| 97.33172182967647 | -0.568 | -0.624 | 0.212 | 0.961 |
| 97.49907028635181 | -0.605 | -0.58 | 0.206 | 0.961 |
| 97.66641874302715 | -0.643 | -0.53 | 0.193 | 0.967 |
| 97.8337671997025 | -0.68 | -0.468 | 0.168 | 0.979 |
| 98.00111565637785 | -0.717 | -0.399 | 0.143 | 0.986 |
| 98.16846411305319 | -0.767 | -0.318 | 0.112 | 1.011 |
| 98.33581256972855 | -0.817 | -0.218 | 0.069 | 1.06 |
| 98.50316102640389 | -0.873 | -0.131 | 0.025 | 1.129 |
| 98.67050948307921 | -0.923 | -0.037 | -0.006 | 1.185 |
| 98.83785793975456 | -0.967 | 0.075 | -0.037 | 1.279 |
| 99.0052063964299 | -1.004 | 0.181 | -0.069 | 1.372 |
| 99.17255485310525 | -1.042 | 0.293 | -0.094 | 1.46 |
| 99.33060617329863 | -1.054 | 0.374 | -0.106 | 1.503 |
| 99.49795462997399 | -1.073 | 0.449 | -0.125 | 1.528 |
| 99.66530308664933 | -1.092 | 0.524 | -0.137 | 1.547 |
| 99.83265154332467 | -1.104 | 0.599 | -0.15 | 1.566 |
| 100.0 | -1.123 | 0.674 | -0.168 | 1.591 |